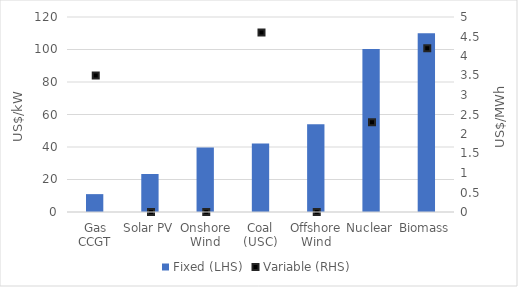
| Category | Fixed (LHS) |
|---|---|
| Gas CCGT | 11 |
| Solar PV | 23.4 |
| Onshore Wind | 39.7 |
| Coal (USC) | 42.1 |
| Offshore Wind | 54 |
| Nuclear | 100.3 |
| Biomass | 110 |